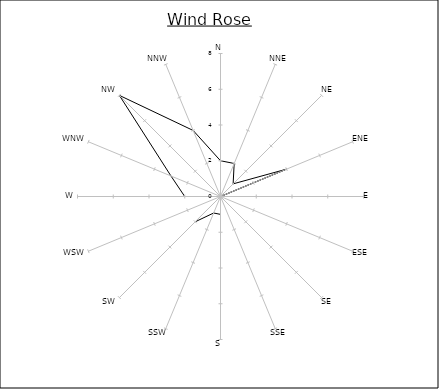
| Category | Series 0 |
|---|---|
| N | 2 |
| NNE | 2 |
| NE | 1 |
| ENE | 4 |
| E | 0 |
| ESE | 0 |
| SE | 0 |
| SSE | 0 |
| S | 1 |
| SSW | 1 |
| SW | 2 |
| WSW | 0 |
| W | 2 |
| WNW | 3 |
| NW | 8 |
| NNW | 4 |